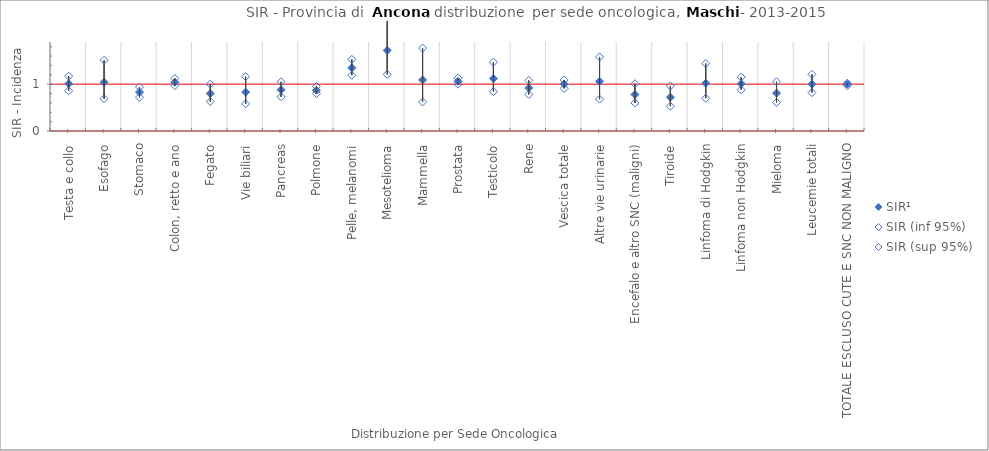
| Category | SIR¹ | SIR (inf 95%) | SIR (sup 95%) |
|---|---|---|---|
| Testa e collo | 1.01 | 0.86 | 1.17 |
| Esofago | 1.04 | 0.69 | 1.51 |
| Stomaco | 0.83 | 0.72 | 0.94 |
| Colon, retto e ano | 1.04 | 0.97 | 1.12 |
| Fegato | 0.8 | 0.63 | 1 |
| Vie biliari | 0.83 | 0.58 | 1.16 |
| Pancreas | 0.88 | 0.73 | 1.05 |
| Polmone | 0.87 | 0.8 | 0.95 |
| Pelle, melanomi | 1.35 | 1.19 | 1.53 |
| Mesotelioma | 1.72 | 1.21 | 2.35 |
| Mammella | 1.09 | 0.62 | 1.77 |
| Prostata | 1.06 | 1 | 1.13 |
| Testicolo | 1.12 | 0.84 | 1.47 |
| Rene | 0.92 | 0.78 | 1.08 |
| Vescica totale | 1 | 0.91 | 1.09 |
| Altre vie urinarie | 1.06 | 0.68 | 1.58 |
| Encefalo e altro SNC (maligni) | 0.78 | 0.6 | 1.01 |
| Tiroide | 0.72 | 0.53 | 0.96 |
| Linfoma di Hodgkin | 1.02 | 0.7 | 1.44 |
| Linfoma non Hodgkin | 1.01 | 0.88 | 1.15 |
| Mieloma | 0.81 | 0.61 | 1.05 |
| Leucemie totali | 1 | 0.82 | 1.21 |
| TOTALE ESCLUSO CUTE E SNC NON MALIGNO | 1 | 0.97 | 1.02 |